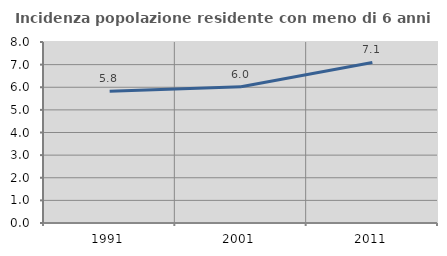
| Category | Incidenza popolazione residente con meno di 6 anni |
|---|---|
| 1991.0 | 5.822 |
| 2001.0 | 6.023 |
| 2011.0 | 7.095 |